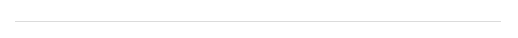
| Category | S1 | S2 | S3 |
|---|---|---|---|
| 0.0 | 1860 | 70 | 0 |
| 10.0 | 1860 | 70 | 0 |
| 90.0 | 1860 | 70 | 0 |
| 100.0 | 1860 | 70 | 0 |